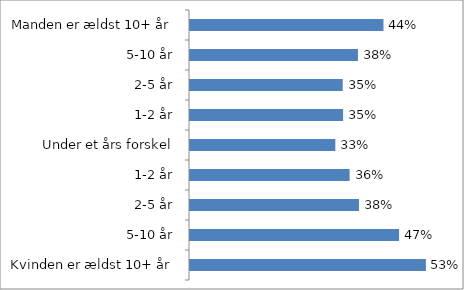
| Category | Series 0 |
|---|---|
| Manden er ældst 10+ år | 0.438 |
| 5-10 år | 0.38 |
| 2-5 år | 0.346 |
| 1-2 år | 0.347 |
| Under et års forskel | 0.329 |
| 1-2 år | 0.361 |
| 2-5 år | 0.383 |
| 5-10 år | 0.473 |
| Kvinden er ældst 10+ år | 0.534 |